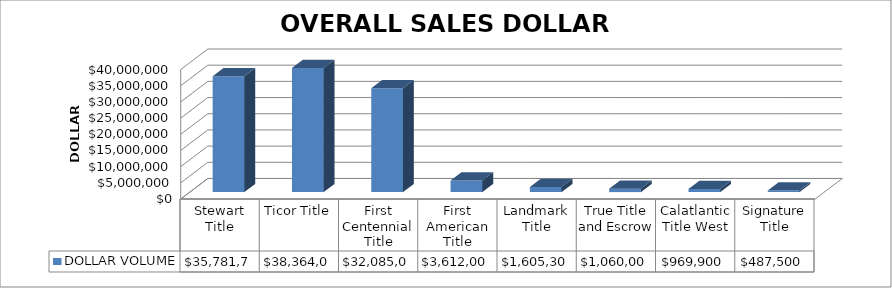
| Category | DOLLAR VOLUME |
|---|---|
| Stewart Title | 35781789 |
| Ticor Title | 38364000 |
| First Centennial Title | 32085000 |
| First American Title | 3612000 |
| Landmark Title | 1605300 |
| True Title and Escrow | 1060000 |
| Calatlantic Title West | 969900 |
| Signature Title | 487500 |